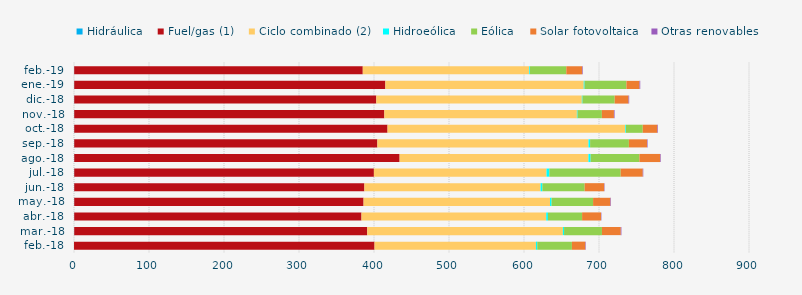
| Category | Hidráulica | Fuel/gas (1) | Ciclo combinado (2) | Hidroeólica | Eólica | Solar fotovoltaica | Otras renovables |
|---|---|---|---|---|---|---|---|
| feb.-18 | 0.034 | 400.679 | 215.217 | 1.754 | 46.206 | 17.886 | 0.647 |
| mar.-18 | 0.31 | 390.68 | 260.839 | 1.6 | 50.516 | 25.105 | 0.837 |
| abr.-18 | 0.276 | 383.044 | 246.338 | 2.263 | 45.546 | 25.211 | 0.539 |
| may.-18 | 0.308 | 385.794 | 248.617 | 2.034 | 55.352 | 23.08 | 0.751 |
| jun.-18 | 0.294 | 386.903 | 234.948 | 2.322 | 56.421 | 25.993 | 0.531 |
| jul.-18 | 0.296 | 399.578 | 230.146 | 3.716 | 95.158 | 29.45 | 0.702 |
| ago.-18 | 0.308 | 433.847 | 251.789 | 2.859 | 65.081 | 27.718 | 0.816 |
| sep.-18 | 0.288 | 404.236 | 281.475 | 2.166 | 51.688 | 24.128 | 0.783 |
| oct.-18 | 0.297 | 417.763 | 317.069 | 0.873 | 22.336 | 19.456 | 0.813 |
| nov.-18 | 0.289 | 413.521 | 256.697 | 0.901 | 32.427 | 16.089 | 0.85 |
| dic.-18 | 0.296 | 402.8 | 273.986 | 0.91 | 42.932 | 18.423 | 0.899 |
| ene.-19 | 0.293 | 414.861 | 264.507 | 1.11 | 55.782 | 17.484 | 0.963 |
| feb.-19 | 0.265 | 384.771 | 221.965 | 0.973 | 48.408 | 21.221 | 0.823 |